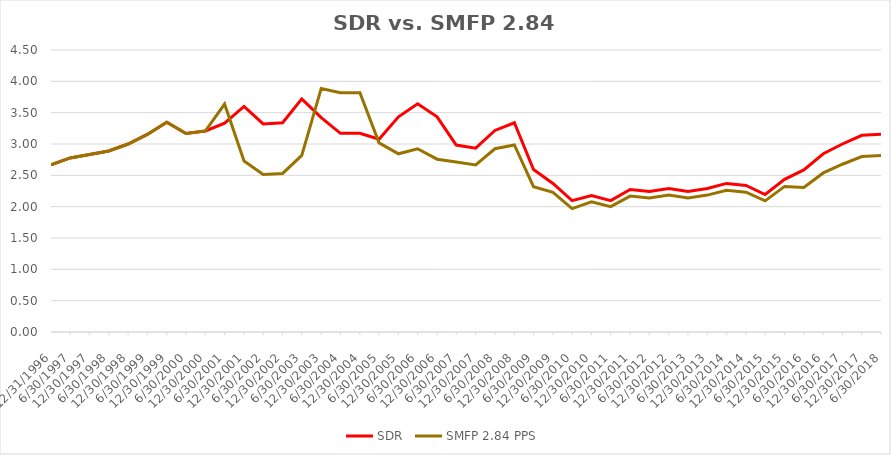
| Category | SDR | SMFP 2.84 PPS |
|---|---|---|
| 12/31/96 | 2.667 | 2.667 |
| 6/30/97 | 2.778 | 2.778 |
| 12/31/97 | 2.833 | 2.833 |
| 6/30/98 | 2.889 | 2.889 |
| 12/31/98 | 3 | 3 |
| 6/30/99 | 3.153 | 3.153 |
| 12/31/99 | 3.347 | 3.347 |
| 6/30/00 | 3.167 | 3.167 |
| 12/31/00 | 3.208 | 3.208 |
| 6/30/01 | 3.333 | 3.636 |
| 12/31/01 | 3.6 | 2.727 |
| 6/30/02 | 3.32 | 2.515 |
| 12/31/02 | 3.34 | 2.53 |
| 6/30/03 | 3.72 | 2.818 |
| 12/31/03 | 3.42 | 3.886 |
| 6/30/04 | 3.17 | 3.818 |
| 12/31/04 | 3.17 | 3.818 |
| 6/30/05 | 3.075 | 3.019 |
| 12/31/05 | 3.434 | 2.844 |
| 6/30/06 | 3.642 | 2.924 |
| 12/31/06 | 3.434 | 2.758 |
| 6/30/07 | 2.983 | 2.712 |
| 12/31/07 | 2.933 | 2.667 |
| 6/30/08 | 3.217 | 2.924 |
| 12/31/08 | 3.339 | 2.985 |
| 6/30/09 | 2.593 | 2.318 |
| 12/31/09 | 2.371 | 2.227 |
| 6/30/10 | 2.097 | 1.97 |
| 12/31/10 | 2.177 | 2.077 |
| 6/30/11 | 2.097 | 2 |
| 12/31/11 | 2.274 | 2.169 |
| 6/30/12 | 2.242 | 2.138 |
| 12/31/12 | 2.29 | 2.185 |
| 6/30/13 | 2.242 | 2.138 |
| 12/31/13 | 2.29 | 2.185 |
| 6/30/14 | 2.371 | 2.262 |
| 12/31/14 | 2.339 | 2.231 |
| 6/30/15 | 2.194 | 2.092 |
| 12/31/15 | 2.435 | 2.323 |
| 6/30/16 | 2.586 | 2.308 |
| 12/31/16 | 2.845 | 2.538 |
| 6/30/17 | 3 | 2.677 |
| 12/31/17 | 3.138 | 2.8 |
| 6/30/18 | 3.155 | 2.815 |